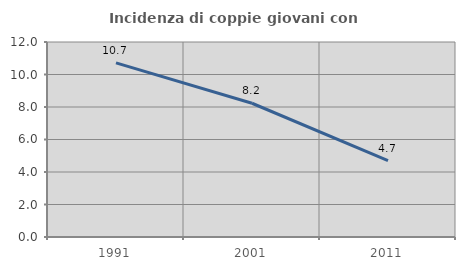
| Category | Incidenza di coppie giovani con figli |
|---|---|
| 1991.0 | 10.714 |
| 2001.0 | 8.23 |
| 2011.0 | 4.701 |